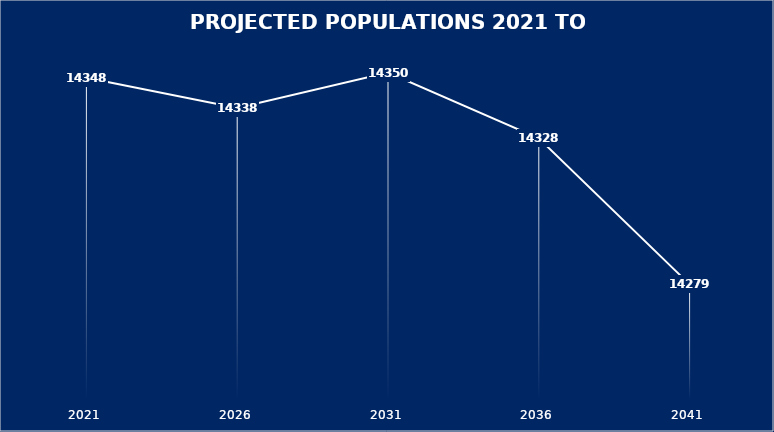
| Category | Total |
|---|---|
| 2021 | 14347.986 |
| 2026 | 14337.817 |
| 2031 | 14349.725 |
| 2036 | 14327.648 |
| 2041 | 14278.525 |